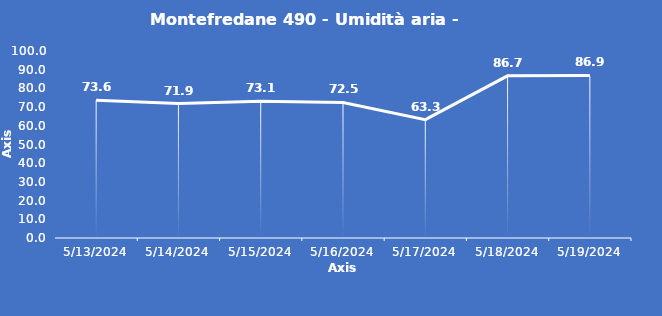
| Category | Montefredane 490 - Umidità aria - Grezzo (%) |
|---|---|
| 5/13/24 | 73.6 |
| 5/14/24 | 71.9 |
| 5/15/24 | 73.1 |
| 5/16/24 | 72.5 |
| 5/17/24 | 63.3 |
| 5/18/24 | 86.7 |
| 5/19/24 | 86.9 |